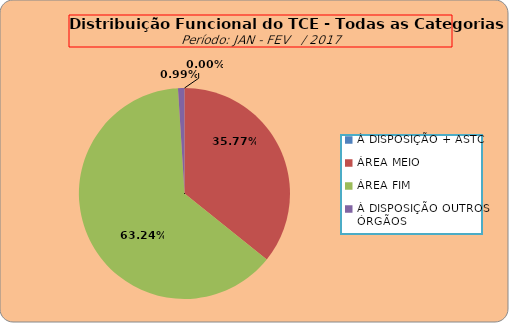
| Category | Series 0 |
|---|---|
| À DISPOSIÇÃO + ASTC | 0 |
| ÁREA MEIO | 181 |
| ÁREA FIM | 320 |
| À DISPOSIÇÃO OUTROS ÓRGÃOS | 5 |